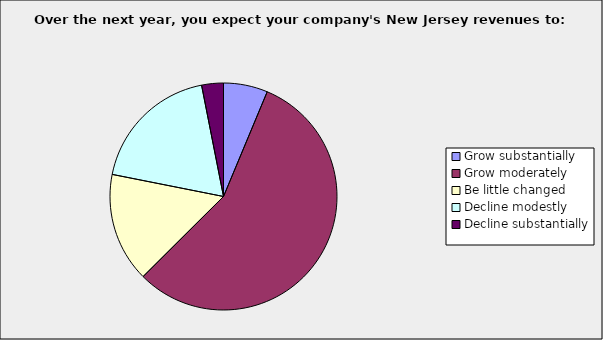
| Category | Series 0 |
|---|---|
| Grow substantially | 0.063 |
| Grow moderately | 0.563 |
| Be little changed | 0.156 |
| Decline modestly | 0.188 |
| Decline substantially | 0.031 |